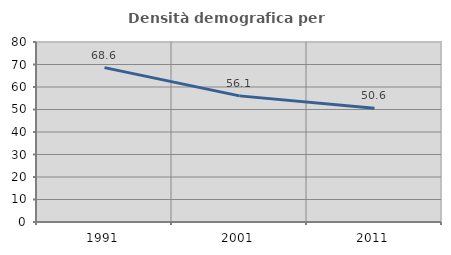
| Category | Densità demografica |
|---|---|
| 1991.0 | 68.622 |
| 2001.0 | 56.054 |
| 2011.0 | 50.563 |